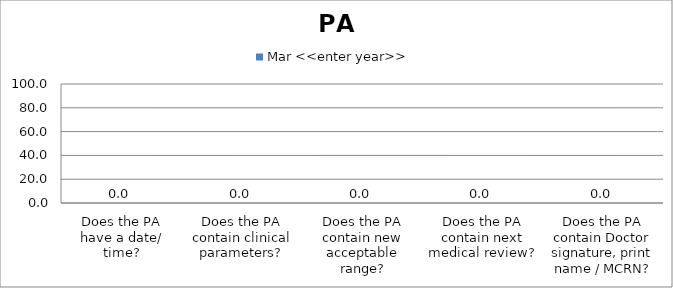
| Category | Mar <<enter year>> |
|---|---|
| Does the PA have a date/ time? | 0 |
| Does the PA contain clinical parameters? | 0 |
| Does the PA contain new acceptable range? | 0 |
| Does the PA contain next medical review? | 0 |
| Does the PA contain Doctor signature, print name / MCRN? | 0 |